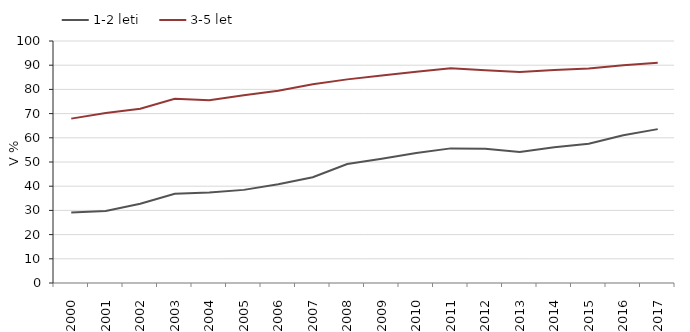
| Category | 1-2 leti | 3-5 let |
|---|---|---|
| 2000 | 29.156 | 67.924 |
| 2001 | 29.76 | 70.262 |
| 2002 | 32.719 | 72.048 |
| 2003 | 36.847 | 76.151 |
| 2004 | 37.39 | 75.488 |
| 2005 | 38.482 | 77.581 |
| 2006 | 40.823 | 79.473 |
| 2007 | 43.731 | 82.142 |
| 2008 | 49.19 | 84.141 |
| 2009 | 51.379 | 85.756 |
| 2010 | 53.673 | 87.331 |
| 2011 | 55.629 | 88.767 |
| 2012 | 55.482 | 87.948 |
| 2013 | 54.127 | 87.195 |
| 2014 | 56.138 | 87.972 |
| 2015 | 57.586 | 88.589 |
| 2016 | 61.041 | 89.936 |
| 2017 | 63.58 | 91.045 |